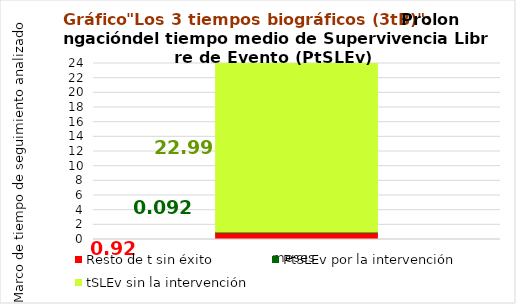
| Category | Resto de t sin éxito | PtSLEv por la intervención | tSLEv sin la intervención |
|---|---|---|---|
| meses | 0.922 | 0.092 | 22.986 |